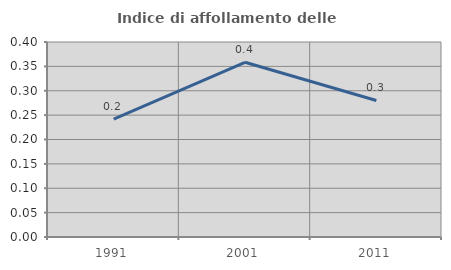
| Category | Indice di affollamento delle abitazioni  |
|---|---|
| 1991.0 | 0.242 |
| 2001.0 | 0.358 |
| 2011.0 | 0.28 |